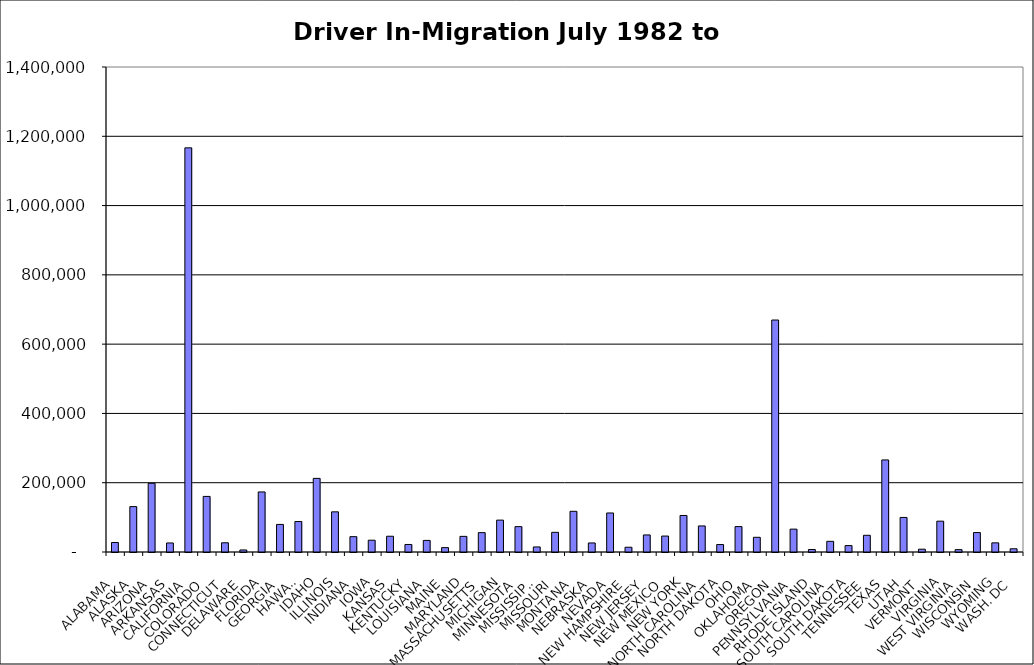
| Category | Series 0 |
|---|---|
| ALABAMA | 27432.5 |
| ALASKA | 131030.5 |
| ARIZONA | 198347 |
| ARKANSAS | 26076.5 |
| CALIFORNIA | 1166635.5 |
| COLORADO | 160446 |
| CONNECTICUT | 26653 |
| DELAWARE | 5865.5 |
| FLORIDA | 173339 |
| GEORGIA | 79562 |
| HAWAII | 87980.5 |
| IDAHO | 212502.5 |
| ILLINOIS | 115956.5 |
| INDIANA | 44270 |
| IOWA | 34015.5 |
| KANSAS | 45473.5 |
| KENTUCKY | 21730 |
| LOUISIANA | 33423.5 |
| MAINE | 12672.5 |
| MARYLAND | 45114 |
| MASSACHUSETTS | 55921 |
| MICHIGAN | 92035 |
| MINNESOTA | 73212.5 |
| MISSISSIPPI | 14574 |
| MISSOURI | 56778 |
| MONTANA | 117466 |
| NEBRASKA | 26113.5 |
| NEVADA | 112633 |
| NEW HAMPSHIRE | 13741.5 |
| NEW JERSEY | 49213 |
| NEW MEXICO | 46042 |
| NEW YORK | 105424 |
| NORTH CAROLINA | 75199.5 |
| NORTH DAKOTA | 21469.5 |
| OHIO | 73328.5 |
| OKLAHOMA | 42423 |
| OREGON | 669621 |
| PENNSYLVANIA | 66024.5 |
| RHODE ISLAND | 7229 |
| SOUTH CAROLINA | 30794.5 |
| SOUTH DAKOTA | 18521.5 |
| TENNESSEE | 48230.5 |
| TEXAS | 265752 |
| UTAH | 99761.5 |
| VERMONT | 8087 |
| VIRGINIA | 88953 |
| WEST VIRGINIA | 6832.5 |
| WISCONSIN | 56148.5 |
| WYOMING | 26416 |
| WASH. DC | 9313 |